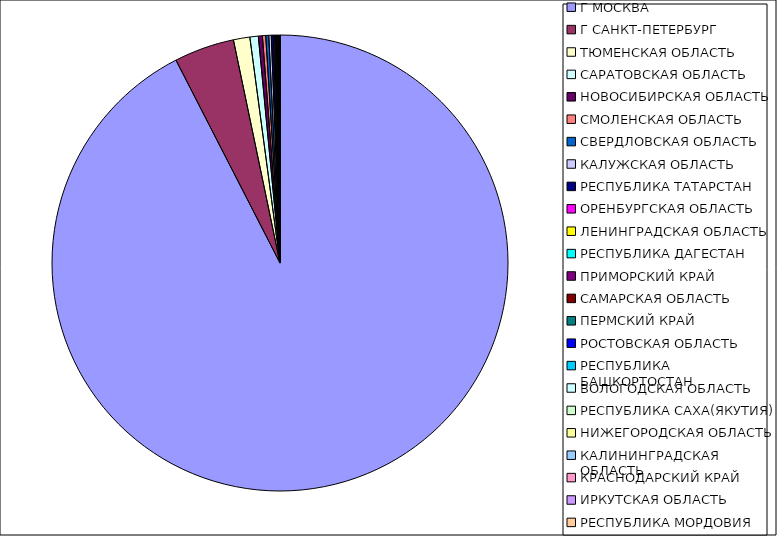
| Category | Оборот |
|---|---|
| Г МОСКВА | 0.924 |
| Г САНКТ-ПЕТЕРБУРГ | 0.043 |
| ТЮМЕНСКАЯ ОБЛАСТЬ | 0.012 |
| САРАТОВСКАЯ ОБЛАСТЬ | 0.006 |
| НОВОСИБИРСКАЯ ОБЛАСТЬ | 0.003 |
| СМОЛЕНСКАЯ ОБЛАСТЬ | 0.002 |
| СВЕРДЛОВСКАЯ ОБЛАСТЬ | 0.002 |
| КАЛУЖСКАЯ ОБЛАСТЬ | 0.002 |
| РЕСПУБЛИКА ТАТАРСТАН | 0.001 |
| ОРЕНБУРГСКАЯ ОБЛАСТЬ | 0.001 |
| ЛЕНИНГРАДСКАЯ ОБЛАСТЬ | 0.001 |
| РЕСПУБЛИКА ДАГЕСТАН | 0.001 |
| ПРИМОРСКИЙ КРАЙ | 0 |
| САМАРСКАЯ ОБЛАСТЬ | 0 |
| ПЕРМСКИЙ КРАЙ | 0 |
| РОСТОВСКАЯ ОБЛАСТЬ | 0 |
| РЕСПУБЛИКА БАШКОРТОСТАН | 0 |
| ВОЛОГОДСКАЯ ОБЛАСТЬ | 0 |
| РЕСПУБЛИКА САХА(ЯКУТИЯ) | 0 |
| НИЖЕГОРОДСКАЯ ОБЛАСТЬ | 0 |
| КАЛИНИНГРАДСКАЯ ОБЛАСТЬ | 0 |
| КРАСНОДАРСКИЙ КРАЙ | 0 |
| ИРКУТСКАЯ ОБЛАСТЬ | 0 |
| РЕСПУБЛИКА МОРДОВИЯ | 0 |
| ТВЕРСКАЯ ОБЛАСТЬ | 0 |
| КЕМЕРОВСКАЯ ОБЛАСТЬ | 0 |
| ЛИПЕЦКАЯ ОБЛАСТЬ | 0 |
| КИРОВСКАЯ ОБЛАСТЬ | 0 |
| КАМЧАТСКИЙ КРАЙ | 0 |